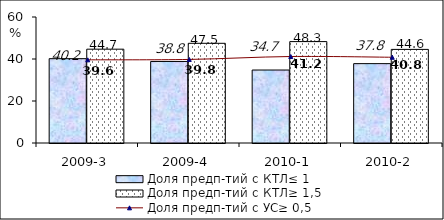
| Category | Доля предп-тий с КТЛ≤ 1 | Доля предп-тий с КТЛ≥ 1,5 |
|---|---|---|
| 2009-3 | 40.161 | 44.677 |
| 2009-4 | 38.825 | 47.471 |
| 2010-1 | 34.747 | 48.287 |
| 2010-2 | 37.793 | 44.574 |